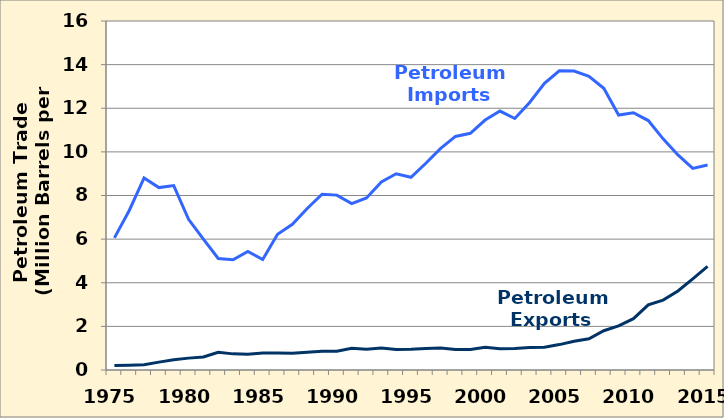
| Category | Petroleum Exports | Petroleum Imports |
|---|---|---|
| 1975.0 | 0.209 | 6.056 |
| 1976.0 | 0.223 | 7.313 |
| 1977.0 | 0.243 | 8.807 |
| 1978.0 | 0.362 | 8.363 |
| 1979.0 | 0.471 | 8.456 |
| 1980.0 | 0.544 | 6.909 |
| 1981.0 | 0.595 | 5.996 |
| 1982.0 | 0.815 | 5.113 |
| 1983.0 | 0.739 | 5.051 |
| 1984.0 | 0.722 | 5.437 |
| 1985.0 | 0.781 | 5.067 |
| 1986.0 | 0.785 | 6.224 |
| 1987.0 | 0.764 | 6.678 |
| 1988.0 | 0.815 | 7.402 |
| 1989.0 | 0.859 | 8.061 |
| 1990.0 | 0.857 | 8.018 |
| 1991.0 | 1.001 | 7.627 |
| 1992.0 | 0.95 | 7.888 |
| 1993.0 | 1.003 | 8.62 |
| 1994.0 | 0.942 | 8.996 |
| 1995.0 | 0.949 | 8.835 |
| 1996.0 | 0.981 | 9.478 |
| 1997.0 | 1.003 | 10.162 |
| 1998.0 | 0.945 | 10.708 |
| 1999.0 | 0.94 | 10.852 |
| 2000.0 | 1.04 | 11.459 |
| 2001.0 | 0.971 | 11.871 |
| 2002.0 | 0.984 | 11.53 |
| 2003.0 | 1.027 | 12.264 |
| 2004.0 | 1.048 | 13.145 |
| 2005.0 | 1.165 | 13.714 |
| 2006.0 | 1.317 | 13.707 |
| 2007.0 | 1.433 | 13.468 |
| 2008.0 | 1.802 | 12.915 |
| 2009.0 | 2.024 | 11.691 |
| 2010.0 | 2.353 | 11.793 |
| 2011.0 | 2.986 | 11.436 |
| 2012.0 | 3.205 | 10.598 |
| 2013.0 | 3.621 | 9.859 |
| 2014.0 | 4.176 | 9.241 |
| 2015.0 | 4.75 | 9.401 |